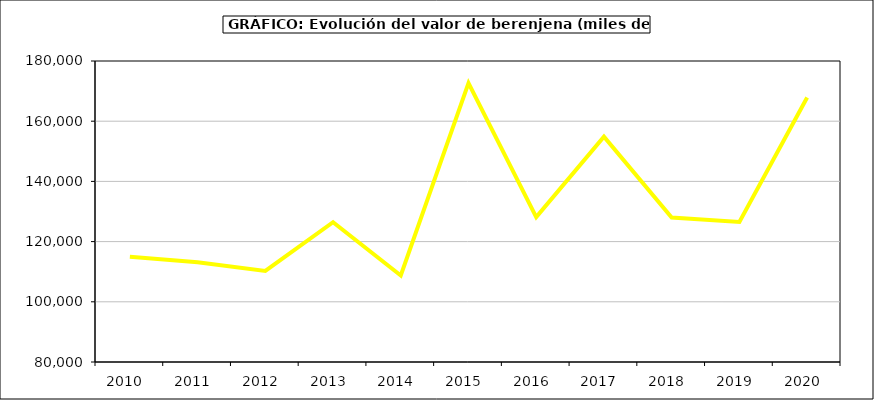
| Category | Valor |
|---|---|
| 2010.0 | 114934.838 |
| 2011.0 | 113149.264 |
| 2012.0 | 110271.616 |
| 2013.0 | 126461.496 |
| 2014.0 | 108753.977 |
| 2015.0 | 172694 |
| 2016.0 | 128140 |
| 2017.0 | 154840.085 |
| 2018.0 | 127980.525 |
| 2019.0 | 126544.365 |
| 2020.0 | 167880.78 |